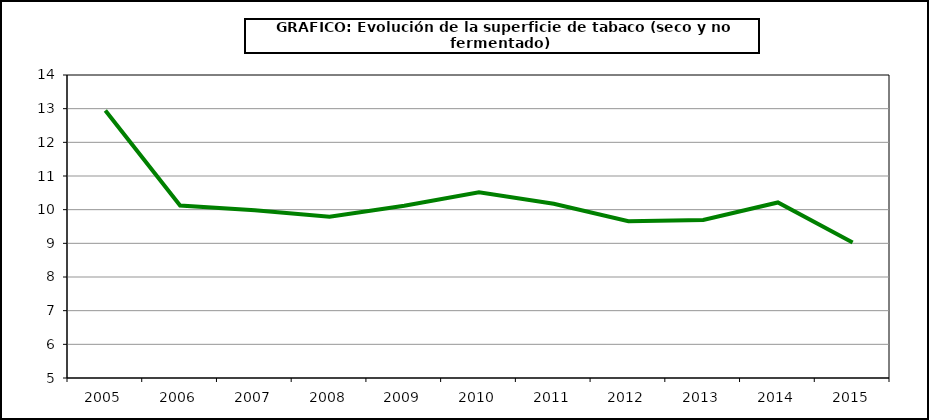
| Category | Superficie |
|---|---|
| 2005.0 | 12.944 |
| 2006.0 | 10.123 |
| 2007.0 | 9.986 |
| 2008.0 | 9.792 |
| 2009.0 | 10.115 |
| 2010.0 | 10.517 |
| 2011.0 | 10.175 |
| 2012.0 | 9.659 |
| 2013.0 | 9.693 |
| 2014.0 | 10.215 |
| 2015.0 | 9.022 |